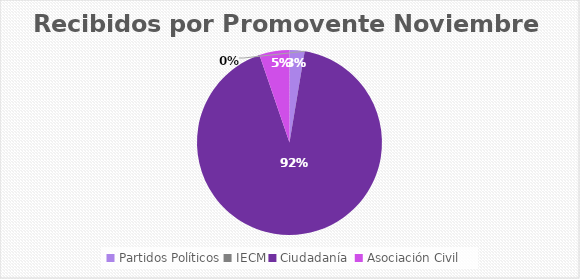
| Category | Recibidos por Promovente NOVIEMBRE |
|---|---|
| Partidos Políticos | 1 |
| IECM | 0 |
| Ciudadanía  | 35 |
| Asociación Civil | 2 |